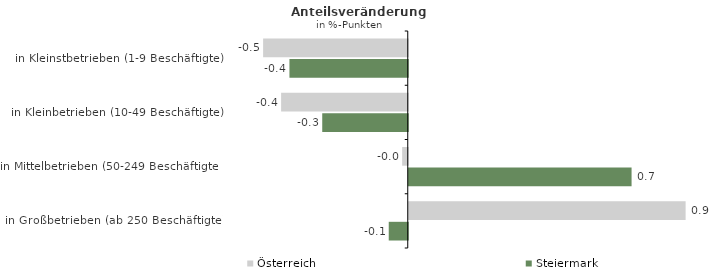
| Category | Österreich | Steiermark |
|---|---|---|
| in Kleinstbetrieben (1-9 Beschäftigte) | -0.48 | -0.393 |
| in Kleinbetrieben (10-49 Beschäftigte) | -0.42 | -0.284 |
| in Mittelbetrieben (50-249 Beschäftigte) | -0.019 | 0.74 |
| in Großbetrieben (ab 250 Beschäftigte) | 0.919 | -0.063 |